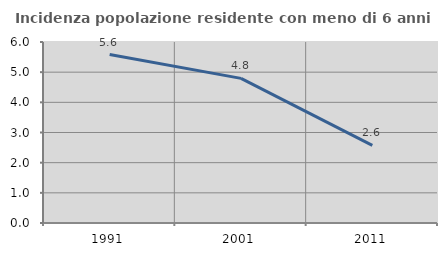
| Category | Incidenza popolazione residente con meno di 6 anni |
|---|---|
| 1991.0 | 5.585 |
| 2001.0 | 4.794 |
| 2011.0 | 2.573 |